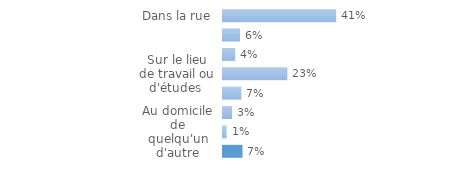
| Category | Series 0 |
|---|---|
| Dans la rue | 0.41 |
| Dans un transport en commun | 0.062 |
| Dans un établissement commercial | 0.044 |
| Sur le lieu de travail ou d'études  | 0.233 |
| Au domicile de la victime | 0.066 |
| Dans l'immeuble de la victime | 0.033 |
| Au domicile de quelqu'un d'autre | 0.013 |
| Dans un autre lieu | 0.071 |